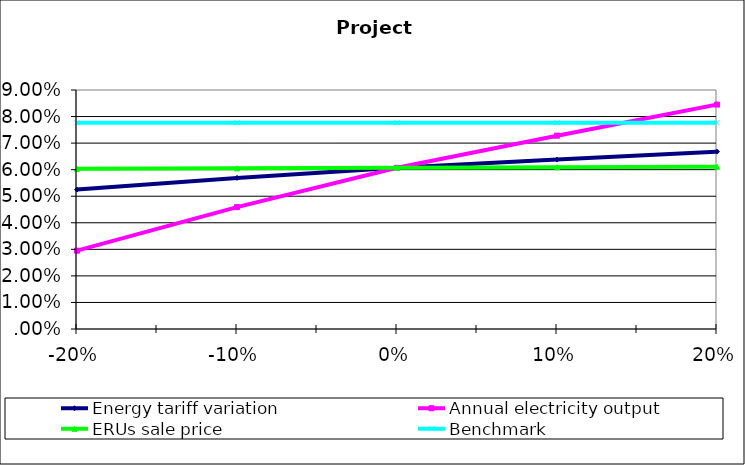
| Category | Energy tariff variation | Annual electricity output | ERUs sale price | Benchmark |
|---|---|---|---|---|
| -0.2 | 0.052 | 0.03 | 0.06 | 0.078 |
| -0.1 | 0.057 | 0.046 | 0.06 | 0.078 |
| 0.0 | 0.061 | 0.061 | 0.061 | 0.078 |
| 0.1 | 0.064 | 0.073 | 0.061 | 0.078 |
| 0.2 | 0.067 | 0.084 | 0.061 | 0.078 |